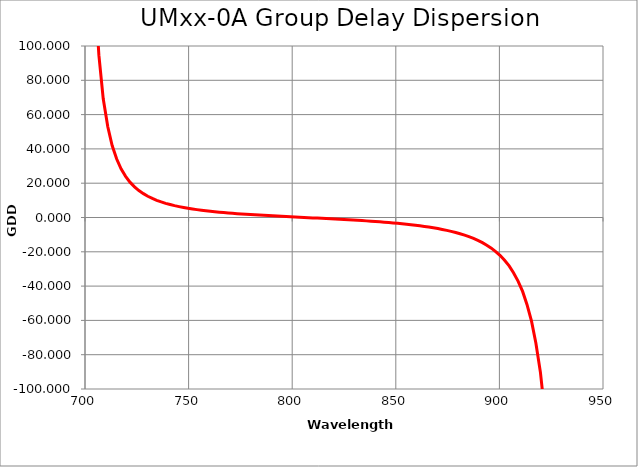
| Category | Series 0 |
|---|---|
| 698.0 | 893.264 |
| 700.2 | 398.686 |
| 702.3 | 219.47 |
| 704.5 | 137.905 |
| 706.7 | 94.67 |
| 708.8 | 69.176 |
| 711.0 | 52.921 |
| 713.1 | 41.92 |
| 715.3 | 34.118 |
| 717.4 | 28.372 |
| 719.6 | 24.009 |
| 721.7 | 20.61 |
| 723.9 | 17.903 |
| 726.0 | 15.709 |
| 728.2 | 13.901 |
| 730.3 | 12.39 |
| 732.5 | 11.113 |
| 734.6 | 10.022 |
| 736.8 | 9.079 |
| 738.9 | 8.259 |
| 741.1 | 7.539 |
| 743.2 | 6.903 |
| 745.4 | 6.336 |
| 747.6 | 5.829 |
| 749.7 | 5.373 |
| 751.9 | 4.959 |
| 754.0 | 4.583 |
| 756.2 | 4.239 |
| 758.3 | 3.923 |
| 760.5 | 3.631 |
| 762.6 | 3.361 |
| 764.8 | 3.109 |
| 766.9 | 2.874 |
| 769.1 | 2.654 |
| 771.2 | 2.446 |
| 773.4 | 2.25 |
| 775.5 | 2.064 |
| 777.7 | 1.887 |
| 779.8 | 1.717 |
| 782.0 | 1.555 |
| 784.1 | 1.399 |
| 786.3 | 1.248 |
| 788.5 | 1.102 |
| 790.6 | 0.959 |
| 792.8 | 0.82 |
| 794.9 | 0.684 |
| 797.1 | 0.551 |
| 799.2 | 0.419 |
| 801.4 | 0.289 |
| 803.5 | 0.159 |
| 805.7 | 0.03 |
| 807.8 | -0.099 |
| 810.0 | -0.228 |
| 812.1 | -0.358 |
| 814.3 | -0.489 |
| 816.4 | -0.622 |
| 818.6 | -0.757 |
| 820.7 | -0.894 |
| 822.9 | -1.034 |
| 825.0 | -1.178 |
| 827.2 | -1.326 |
| 829.4 | -1.478 |
| 831.5 | -1.635 |
| 833.7 | -1.798 |
| 835.8 | -1.968 |
| 838.0 | -2.144 |
| 840.1 | -2.328 |
| 842.3 | -2.522 |
| 844.4 | -2.724 |
| 846.6 | -2.938 |
| 848.7 | -3.164 |
| 850.9 | -3.402 |
| 853.0 | -3.656 |
| 855.2 | -3.926 |
| 857.3 | -4.214 |
| 859.5 | -4.522 |
| 861.6 | -4.853 |
| 863.8 | -5.209 |
| 865.9 | -5.594 |
| 868.1 | -6.011 |
| 870.3 | -6.464 |
| 872.4 | -6.958 |
| 874.6 | -7.498 |
| 876.7 | -8.092 |
| 878.9 | -8.748 |
| 881.0 | -9.474 |
| 883.2 | -10.281 |
| 885.3 | -11.184 |
| 887.5 | -12.198 |
| 889.6 | -13.345 |
| 891.8 | -14.648 |
| 893.9 | -16.139 |
| 896.1 | -17.856 |
| 898.2 | -19.85 |
| 900.4 | -22.184 |
| 902.5 | -24.943 |
| 904.7 | -28.235 |
| 906.8 | -32.21 |
| 909.0 | -37.07 |
| 911.2 | -43.096 |
| 913.3 | -50.69 |
| 915.5 | -60.43 |
| 917.6 | -73.187 |
| 919.8 | -90.293 |
| 921.9 | -113.87 |
| 924.1 | -147.427 |
| 926.2 | -197.039 |
| 928.4 | -273.803 |
| 930.5 | -399.298 |
| 932.7 | -618.584 |